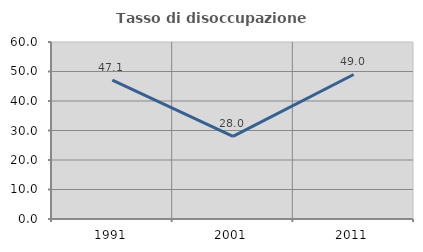
| Category | Tasso di disoccupazione giovanile  |
|---|---|
| 1991.0 | 47.059 |
| 2001.0 | 28 |
| 2011.0 | 48.993 |